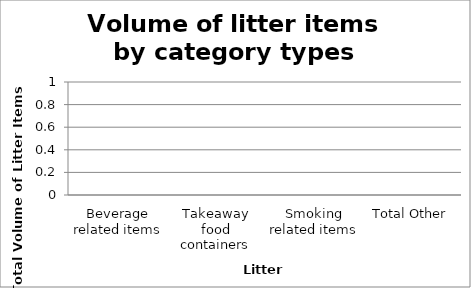
| Category | Series 0 |
|---|---|
| Beverage related items | 0 |
| Takeaway food containers | 0 |
| Smoking related items | 0 |
| Total Other | 0 |